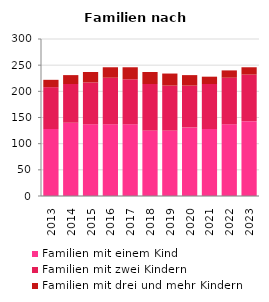
| Category | Familien mit einem Kind | Familien mit zwei Kindern | Familien mit drei und mehr Kindern |
|---|---|---|---|
| 2013.0 | 128 | 80 | 14 |
| 2014.0 | 140 | 74 | 17 |
| 2015.0 | 137 | 80 | 20 |
| 2016.0 | 137 | 89 | 20 |
| 2017.0 | 137 | 86 | 23 |
| 2018.0 | 125 | 89 | 23 |
| 2019.0 | 125 | 86 | 23 |
| 2020.0 | 131 | 80 | 20 |
| 2021.0 | 128 | 86 | 14 |
| 2022.0 | 137 | 89 | 14 |
| 2023.0 | 143 | 89 | 14 |